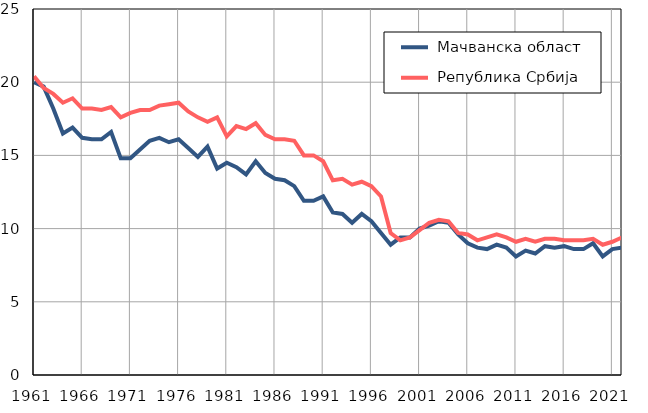
| Category |  Мачванска област |  Република Србија |
|---|---|---|
| 1961.0 | 20 | 20.4 |
| 1962.0 | 19.7 | 19.6 |
| 1963.0 | 18.2 | 19.2 |
| 1964.0 | 16.5 | 18.6 |
| 1965.0 | 16.9 | 18.9 |
| 1966.0 | 16.2 | 18.2 |
| 1967.0 | 16.1 | 18.2 |
| 1968.0 | 16.1 | 18.1 |
| 1969.0 | 16.6 | 18.3 |
| 1970.0 | 14.8 | 17.6 |
| 1971.0 | 14.8 | 17.9 |
| 1972.0 | 15.4 | 18.1 |
| 1973.0 | 16 | 18.1 |
| 1974.0 | 16.2 | 18.4 |
| 1975.0 | 15.9 | 18.5 |
| 1976.0 | 16.1 | 18.6 |
| 1977.0 | 15.5 | 18 |
| 1978.0 | 14.9 | 17.6 |
| 1979.0 | 15.6 | 17.3 |
| 1980.0 | 14.1 | 17.6 |
| 1981.0 | 14.5 | 16.3 |
| 1982.0 | 14.2 | 17 |
| 1983.0 | 13.7 | 16.8 |
| 1984.0 | 14.6 | 17.2 |
| 1985.0 | 13.8 | 16.4 |
| 1986.0 | 13.4 | 16.1 |
| 1987.0 | 13.3 | 16.1 |
| 1988.0 | 12.9 | 16 |
| 1989.0 | 11.9 | 15 |
| 1990.0 | 11.9 | 15 |
| 1991.0 | 12.2 | 14.6 |
| 1992.0 | 11.1 | 13.3 |
| 1993.0 | 11 | 13.4 |
| 1994.0 | 10.4 | 13 |
| 1995.0 | 11 | 13.2 |
| 1996.0 | 10.5 | 12.9 |
| 1997.0 | 9.7 | 12.2 |
| 1998.0 | 8.9 | 9.7 |
| 1999.0 | 9.4 | 9.2 |
| 2000.0 | 9.4 | 9.4 |
| 2001.0 | 10 | 9.9 |
| 2002.0 | 10.2 | 10.4 |
| 2003.0 | 10.5 | 10.6 |
| 2004.0 | 10.4 | 10.5 |
| 2005.0 | 9.6 | 9.7 |
| 2006.0 | 9 | 9.6 |
| 2007.0 | 8.7 | 9.2 |
| 2008.0 | 8.6 | 9.4 |
| 2009.0 | 8.9 | 9.6 |
| 2010.0 | 8.7 | 9.4 |
| 2011.0 | 8.1 | 9.1 |
| 2012.0 | 8.5 | 9.3 |
| 2013.0 | 8.3 | 9.1 |
| 2014.0 | 8.8 | 9.3 |
| 2015.0 | 8.7 | 9.3 |
| 2016.0 | 8.8 | 9.2 |
| 2017.0 | 8.6 | 9.2 |
| 2018.0 | 8.6 | 9.2 |
| 2019.0 | 9 | 9.3 |
| 2020.0 | 8.1 | 8.9 |
| 2021.0 | 8.6 | 9.1 |
| 2022.0 | 8.7 | 9.4 |